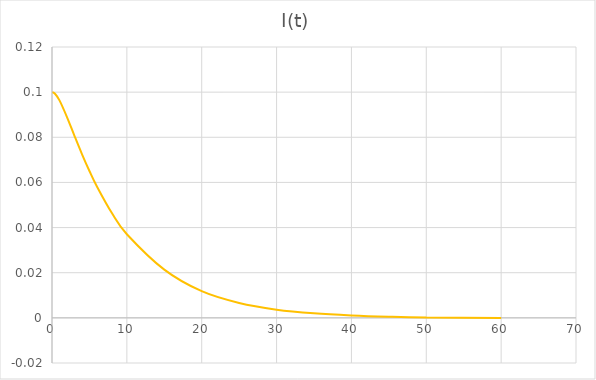
| Category | I(t) |
|---|---|
| 0.0 | 0.1 |
| 0.4 | 0.099 |
| 1.0 | 0.096 |
| 2.0 | 0.089 |
| 3.0 | 0.081 |
| 4.0 | 0.073 |
| 5.0 | 0.065 |
| 6.0 | 0.058 |
| 8.0 | 0.046 |
| 10.0 | 0.037 |
| 15.0 | 0.021 |
| 20.0 | 0.012 |
| 25.0 | 0.007 |
| 30.0 | 0.004 |
| 35.0 | 0.002 |
| 40.0 | 0.001 |
| 45.0 | 0 |
| 50.0 | 0 |
| 60.0 | 0 |